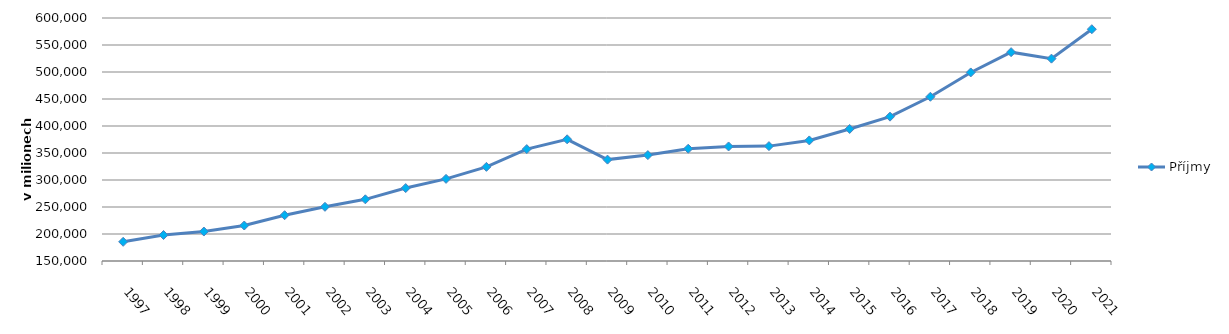
| Category | Příjmy |
|---|---|
| 1997.0 | 185536 |
| 1998.0 | 198130 |
| 1999.0 | 204553 |
| 2000.0 | 215714 |
| 2001.0 | 234814.549 |
| 2002.0 | 250348.776 |
| 2003.0 | 264208 |
| 2004.0 | 285063.585 |
| 2005.0 | 302085.434 |
| 2006.0 | 324349.868 |
| 2007.0 | 357209.569 |
| 2008.0 | 375367.744 |
| 2009.0 | 337757.504 |
| 2010.0 | 346101.251 |
| 2011.0 | 357918.769 |
| 2012.0 | 362096.736 |
| 2013.0 | 362757.729 |
| 2014.0 | 373273.424 |
| 2015.0 | 394506.653 |
| 2016.0 | 417316.13 |
| 2017.0 | 454140.097 |
| 2018.0 | 499185.346 |
| 2019.0 | 536721.843 |
| 2020.0 | 524738.898 |
| 2021.0 | 579232.592 |